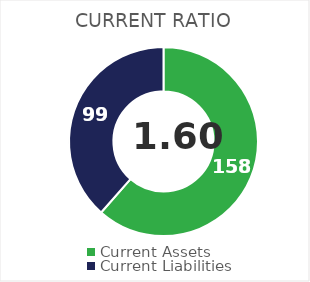
| Category | Jan |
|---|---|
| Current Assets | 158 |
| Current Liabilities | 99 |